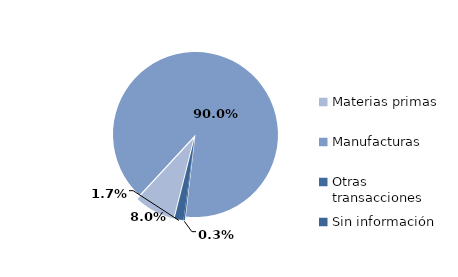
| Category | Series 0 |
|---|---|
| Materias primas | 804.368 |
| Manufacturas | 9075.189 |
| Otras transacciones | 28.216 |
| Sin información | 175.975 |